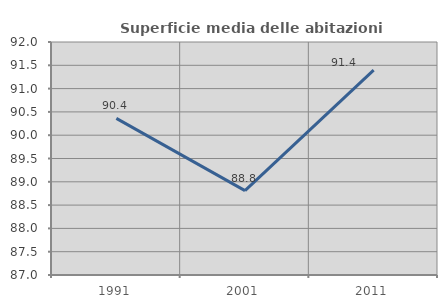
| Category | Superficie media delle abitazioni occupate |
|---|---|
| 1991.0 | 90.361 |
| 2001.0 | 88.811 |
| 2011.0 | 91.397 |